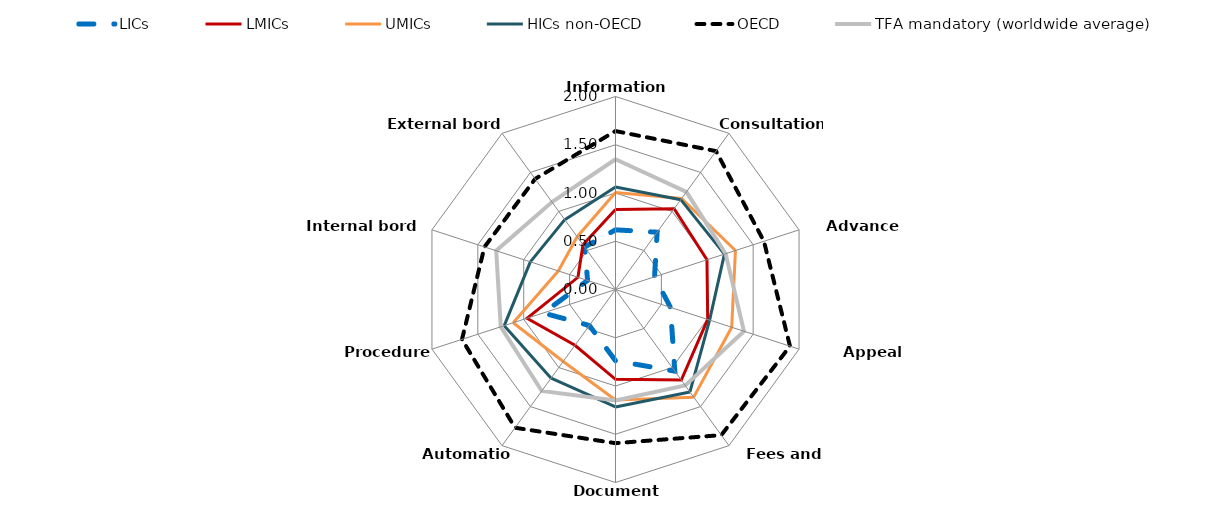
| Category | LICs | LMICs | UMICs | HICs non-OECD | OECD | TFA mandatory (worldwide average) |
|---|---|---|---|---|---|---|
| Information availability | 0.618 | 0.83 | 1.005 | 1.063 | 1.642 | 1.35 |
| Consultations | 0.734 | 1.034 | 1.166 | 1.151 | 1.772 | 1.25 |
| Advance rulings | 0.425 | 0.997 | 1.307 | 1.187 | 1.617 | 1.2 |
| Appeal procedures | 0.599 | 1.005 | 1.266 | 1.025 | 1.901 | 1.4 |
| Fees and charges | 1.046 | 1.16 | 1.379 | 1.312 | 1.865 | 1.23 |
| Documents | 0.738 | 0.93 | 1.144 | 1.217 | 1.593 | 1.15 |
| Automation | 0.461 | 0.714 | 0.922 | 1.135 | 1.771 | 1.3 |
| Procedures | 0.787 | 0.964 | 1.115 | 1.212 | 1.672 | 1.25 |
| Internal bord coop | 0.304 | 0.409 | 0.623 | 0.928 | 1.427 | 1.3 |
| External bord coop | 0.544 | 0.573 | 0.676 | 0.894 | 1.417 | 1.12 |